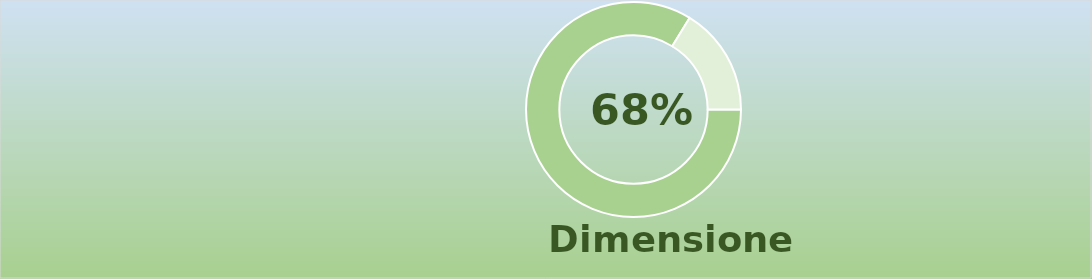
| Category | Series 0 |
|---|---|
| 0 | 1.675 |
| 1 | 0.325 |